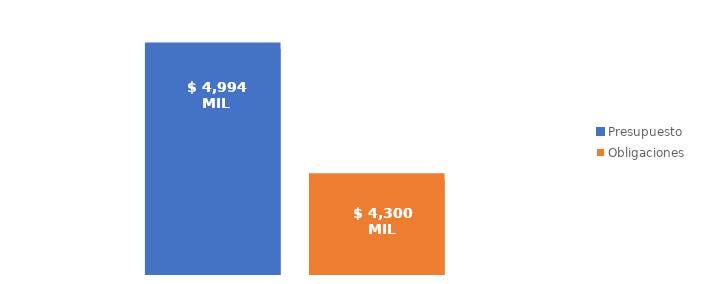
| Category | Presupuesto | Obligaciones |
|---|---|---|
| Total | 4993623999712.337 | 4300411257171.799 |